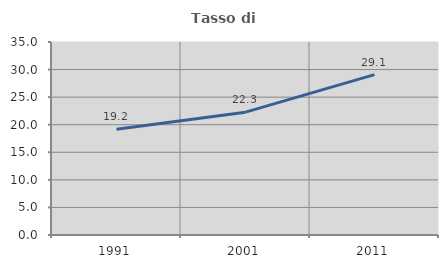
| Category | Tasso di occupazione   |
|---|---|
| 1991.0 | 19.173 |
| 2001.0 | 22.275 |
| 2011.0 | 29.091 |